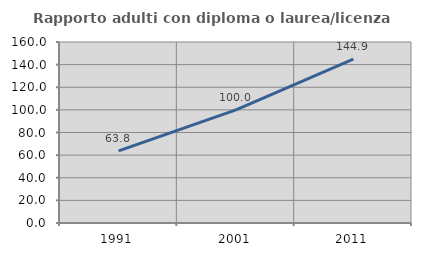
| Category | Rapporto adulti con diploma o laurea/licenza media  |
|---|---|
| 1991.0 | 63.783 |
| 2001.0 | 100 |
| 2011.0 | 144.861 |